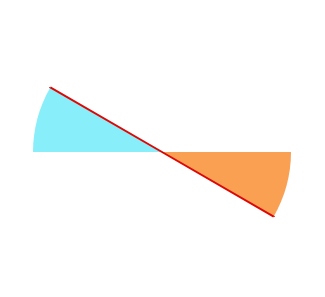
| Category | Series 0 |
|---|---|
| 0 | 90 |
| 1 | 30.01 |
| 2 | 0 |
| 3 | 59.99 |
| 4 | 90 |
| 5 | 0 |
| 6 | 30 |
| 7 | 0 |
| 8 | 60 |